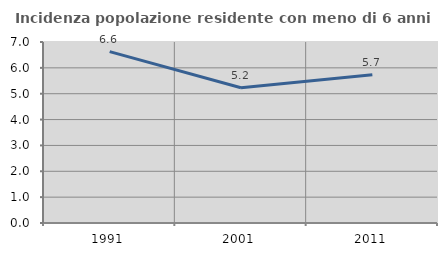
| Category | Incidenza popolazione residente con meno di 6 anni |
|---|---|
| 1991.0 | 6.63 |
| 2001.0 | 5.23 |
| 2011.0 | 5.735 |